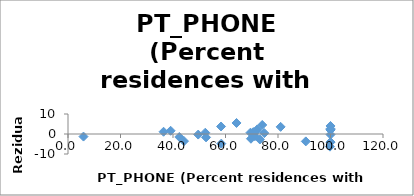
| Category | Series 0 |
|---|---|
| 74.8 | 0.432 |
| 100.0 | -4.092 |
| 69.7 | -2.364 |
| 100.0 | -0.295 |
| 74.0 | 4.51 |
| 73.1 | -2.739 |
| 52.3 | 0.633 |
| 49.6 | -0.289 |
| 71.2 | -1.084 |
| 70.6 | 0.945 |
| 64.2 | 5.511 |
| 58.3 | 3.757 |
| 100.0 | 4.013 |
| 72.0 | 1.871 |
| 100.0 | 2.605 |
| 100.0 | 1.996 |
| 69.5 | 0.655 |
| 81.0 | 3.566 |
| 39.1 | 1.606 |
| 58.4 | -4.817 |
| 42.4 | -1.481 |
| 36.4 | 1.121 |
| 99.8 | -6.326 |
| 90.6 | -3.697 |
| 5.9 | -1.285 |
| 44.2 | -3.569 |
| 100.0 | 2.231 |
| 52.6 | -1.69 |
| 100.0 | -4.005 |
| 72.1 | 2.279 |